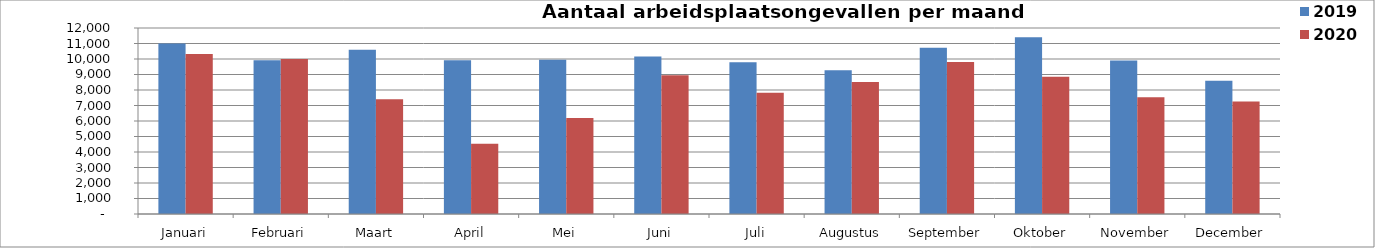
| Category | 2019 | 2020 |
|---|---|---|
| Januari | 10994 | 10324 |
| Februari | 9916 | 10005 |
| Maart | 10598 | 7409 |
| April | 9923 | 4528 |
| Mei | 9953 | 6186 |
| Juni | 10167 | 8950 |
| Juli | 9792 | 7826 |
| Augustus | 9282 | 8514 |
| September | 10733 | 9802 |
| Oktober | 11405 | 8850 |
| November | 9896 | 7525 |
| December | 8604 | 7254 |